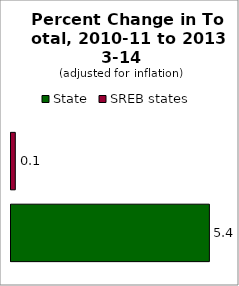
| Category | State | SREB states |
|---|---|---|
| 0 | 5.436 | 0.118 |